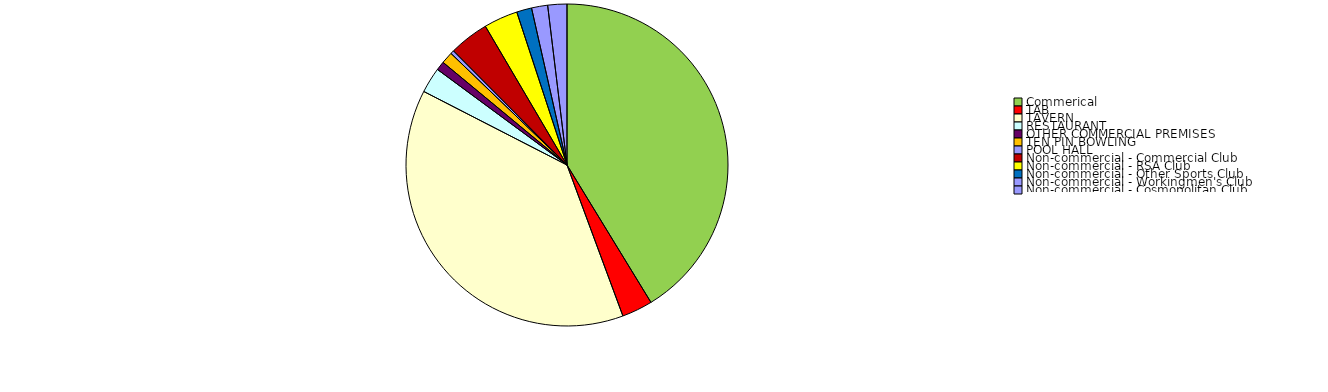
| Category | Series 0 |
|---|---|
| Commerical | 79307333.74 |
| TAB | 5932677.94 |
| TAVERN | 73401162.65 |
| RESTAURANT | 4924089.79 |
| OTHER COMMERCIAL PREMISES | 1721387.11 |
| TEN PIN BOWLING | 2268524.94 |
| POOL HALL | 678652.19 |
| Non-commercial - Commercial Club | 7678685.22 |
| Non-commercial - RSA Club | 6567602.46 |
| Non-commercial - Other Sports Club | 2902557.81 |
| Non-commercial - Workingmen's Club | 3105963.51 |
| Non-commercial - Cosmopolitan Club | 3691107.87 |